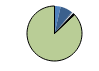
| Category | Series 0 |
|---|---|
| ARRASTRE | 8 |
| CERCO | 16 |
| ATUNEROS CAÑEROS | 1 |
| PALANGRE DE FONDO | 1 |
| PALANGRE DE SUPERFICIE | 1 |
| RASCO | 0 |
| VOLANTA | 1 |
| ARTES FIJAS | 1 |
| ARTES MENORES | 194 |